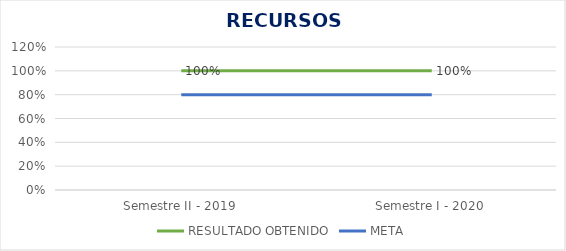
| Category | RESULTADO OBTENIDO | META |
|---|---|---|
| Semestre II - 2019 | 1 | 0.8 |
| Semestre I - 2020 | 1 | 0.8 |